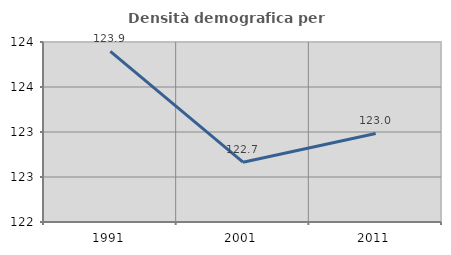
| Category | Densità demografica |
|---|---|
| 1991.0 | 123.897 |
| 2001.0 | 122.665 |
| 2011.0 | 122.984 |